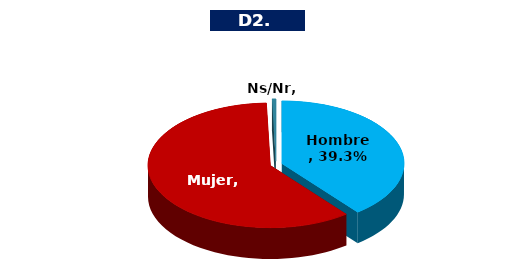
| Category | Series 0 |
|---|---|
| Hombre  | 0.393 |
| Mujer | 0.602 |
| Ns/Nr | 0.005 |